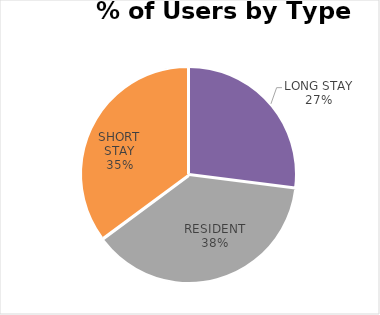
| Category | QUEEN'S ROAD |
|---|---|
| COMMUTER | 0 |
| ILLEGAL | 0 |
| LONG STAY | 10 |
| RESIDENT | 14 |
| SHORT STAY | 13 |
| DISABLED | 0 |
| OTHER | 0 |